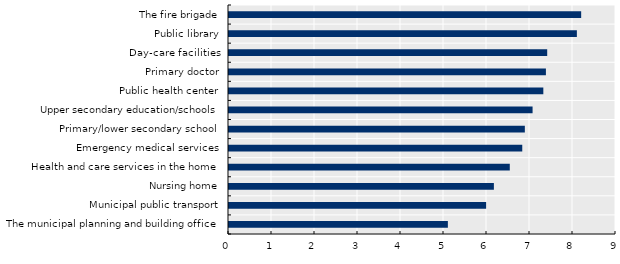
| Category | Satisfaction |
|---|---|
| The municipal planning and building office | 5.09 |
| Municipal public transport | 5.98 |
| Nursing home | 6.16 |
| Health and care services in the home | 6.53 |
| Emergency medical services | 6.82 |
| Primary/lower secondary school | 6.88 |
| Upper secondary education/schools | 7.06 |
| Public health center | 7.31 |
| Primary doctor | 7.37 |
| Day-care facilities | 7.4 |
| Public library | 8.09 |
| The fire brigade | 8.19 |